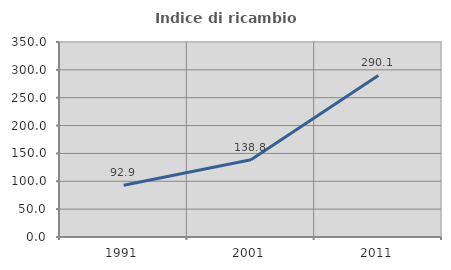
| Category | Indice di ricambio occupazionale  |
|---|---|
| 1991.0 | 92.87 |
| 2001.0 | 138.758 |
| 2011.0 | 290.078 |